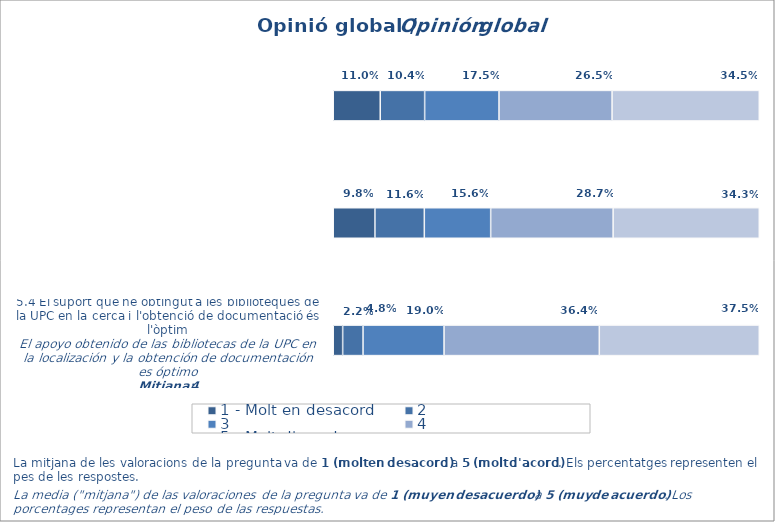
| Category | 1 - Molt en desacord | 2 | 3 | 4 | 5 - Molt d'acord |
|---|---|---|---|---|---|
| 1.0 | 0.11 | 0.104 | 0.175 | 0.265 | 0.345 |
| 2.0 | 0.098 | 0.116 | 0.156 | 0.287 | 0.343 |
| 3.0 | 0.022 | 0.048 | 0.19 | 0.364 | 0.375 |